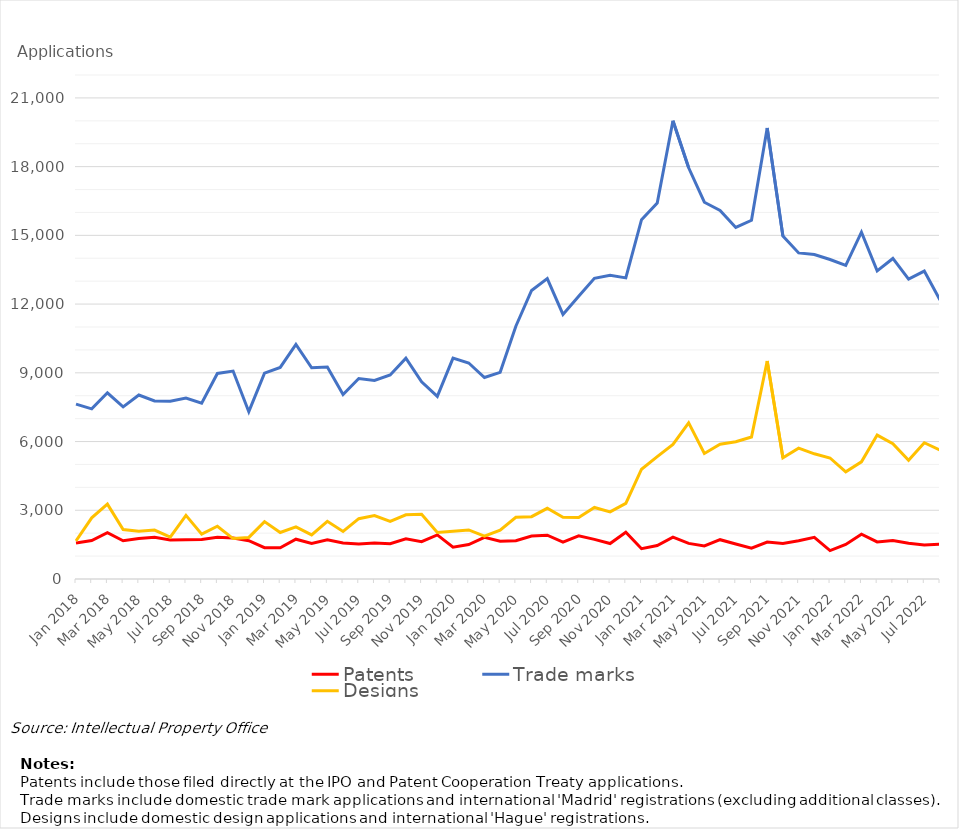
| Category | Patents | Trade marks | Designs |
|---|---|---|---|
| Jan 2018 | 1575 | 7634 | 1658 |
| Feb 2018 | 1676 | 7428 | 2672 |
| Mar 2018 | 2022 | 8127 | 3267 |
| Apr 2018 | 1670 | 7512 | 2160 |
| May 2018 | 1767 | 8030 | 2083 |
| Jun 2018 | 1821 | 7769 | 2136 |
| Jul 2018 | 1704 | 7757 | 1832 |
| Aug 2018 | 1713 | 7897 | 2777 |
| Sep 2018 | 1725 | 7673 | 1960 |
| Oct 2018 | 1818 | 8972 | 2302 |
| Nov 2018 | 1787 | 9076 | 1765 |
| Dec 2018 | 1670 | 7304 | 1815 |
| Jan 2019 | 1367 | 8985 | 2505 |
| Feb 2019 | 1361 | 9234 | 2031 |
| Mar 2019 | 1737 | 10243 | 2274 |
| Apr 2019 | 1552 | 9219 | 1923 |
| May 2019 | 1710 | 9251 | 2520 |
| Jun 2019 | 1569 | 8053 | 2074 |
| Jul 2019 | 1527 | 8752 | 2634 |
| Aug 2019 | 1571 | 8670 | 2768 |
| Sep 2019 | 1540 | 8907 | 2511 |
| Oct 2019 | 1755 | 9636 | 2800 |
| Nov 2019 | 1630 | 8607 | 2827 |
| Dec 2019 | 1926 | 7970 | 2028 |
| Jan 2020 | 1391 | 9642 | 2082 |
| Feb 2020 | 1504 | 9428 | 2143 |
| Mar 2020 | 1819 | 8794 | 1872 |
| Apr 2020 | 1648 | 9021 | 2127 |
| May 2020 | 1672 | 11035 | 2695 |
| Jun 2020 | 1879 | 12593 | 2721 |
| Jul 2020 | 1912 | 13110 | 3086 |
| Aug 2020 | 1614 | 11551 | 2695 |
| Sep 2020 | 1885 | 12340 | 2686 |
| Oct 2020 | 1730 | 13126 | 3124 |
| Nov 2020 | 1547 | 13254 | 2930 |
| Dec 2020 | 2042 | 13144 | 3302 |
| Jan 2021 | 1324 | 15685 | 4792 |
| Feb 2021 | 1462 | 16412 | 5340 |
| Mar 2021 | 1828 | 20001 | 5878 |
| Apr 2021 | 1554 | 17951 | 6815 |
| May 2021 | 1446 | 16446 | 5480 |
| Jun 2021 | 1716 | 16091 | 5881 |
| Jul 2021 | 1528 | 15345 | 5989 |
| Aug 2021 | 1344 | 15659 | 6200 |
| Sep 2021 | 1615 | 19685 | 9518 |
| Oct 2021 | 1547 | 14968 | 5292 |
| Nov 2021 | 1670 | 14233 | 5712 |
| Dec 2021 | 1817 | 14162 | 5464 |
| Jan 2022 | 1240 | 13945 | 5282 |
| Feb 2022 | 1507 | 13690 | 4679 |
| Mar 2022 | 1953 | 15141 | 5113 |
| Apr 2022 | 1617 | 13450 | 6282 |
| May 2022 | 1683 | 13992 | 5906 |
| Jun 2022 | 1559 | 13093 | 5179 |
| Jul 2022 | 1489 | 13440 | 5947 |
| Aug 2022 | 1520 | 12182 | 5627 |